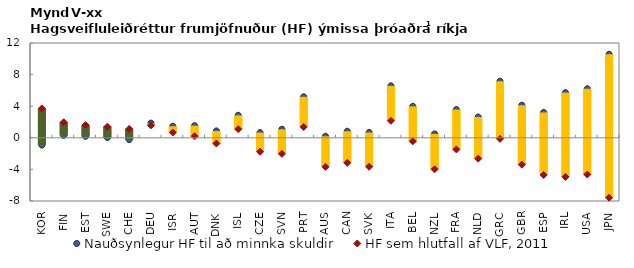
| Category | Nauðsynlegur HF til að minnka skuldir | HF sem hlutfall af VLF, 2011 |
|---|---|---|
| KOR | -0.918 | 3.724 |
| FIN | 0.303 | 1.967 |
| EST | 0.18 | 1.613 |
| SWE | 0.037 | 1.407 |
| CHE | -0.226 | 1.125 |
| DEU | 1.86 | 1.575 |
| ISR | 1.458 | 0.667 |
| AUT | 1.537 | 0.204 |
| DNK | 0.867 | -0.724 |
| ISL | 2.849 | 1.093 |
| CZE | 0.657 | -1.762 |
| SVN | 1.076 | -2.033 |
| PRT | 5.188 | 1.374 |
| AUS | 0.193 | -3.677 |
| CAN | 0.829 | -3.163 |
| SVK | 0.671 | -3.661 |
| ITA | 6.575 | 2.152 |
| BEL | 3.98 | -0.446 |
| NZL | 0.492 | -3.988 |
| FRA | 3.575 | -1.472 |
| NLD | 2.632 | -2.635 |
| GRC | 7.157 | -0.135 |
| GBR | 4.118 | -3.395 |
| ESP | 3.211 | -4.703 |
| IRL | 5.715 | -4.95 |
| USA | 6.208 | -4.642 |
| JPN | 10.569 | -7.589 |